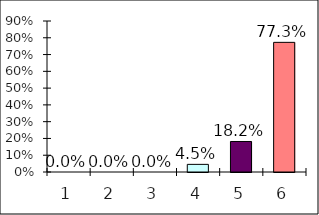
| Category | Series 0 |
|---|---|
| 0 | 0 |
| 1 | 0 |
| 2 | 0 |
| 3 | 0.045 |
| 4 | 0.182 |
| 5 | 0.773 |